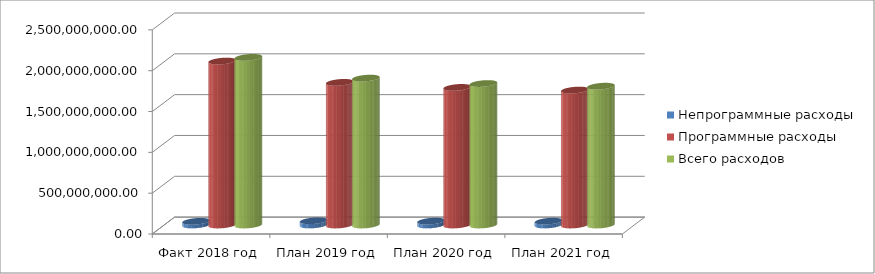
| Category | Непрограммные расходы | Программные расходы | Всего расходов |
|---|---|---|---|
| Факт 2018 год | 45176339.45 | 2008060562.82 | 2053236902.27 |
| План 2019 год | 52019140 | 1747103960 | 1799123100 |
| План 2020 год | 47589440 | 1685433330 | 1733022770 |
| План 2021 год | 47242840 | 1652871930 | 1700114770 |